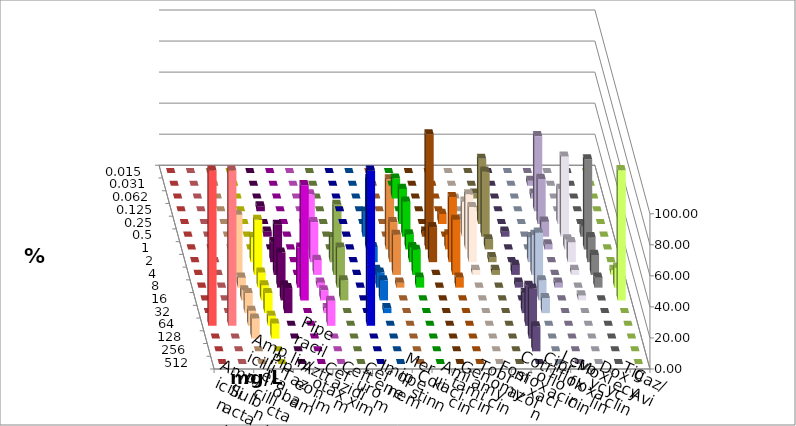
| Category | Ampicillin | Ampicillin/ Sulbactam | Piperacillin | Piperacillin/ Tazobactam | Aztreonam | Cefotaxim | Ceftazidim | Cefuroxim | Imipenem | Meropenem | Colistin | Amikacin | Gentamicin | Tobramycin | Fosfomycin | Cotrimoxazol | Ciprofloxacin | Levofloxacin | Moxifloxacin | Doxycyclin | Tigecyclin | Caz/Avi |
|---|---|---|---|---|---|---|---|---|---|---|---|---|---|---|---|---|---|---|---|---|---|---|
| 0.015 | 0 | 0 | 0 | 0 | 0 | 0 | 0 | 0 | 0 | 0 | 0 | 0 | 0 | 0 | 0 | 0 | 0 | 0 | 0 | 0 | 0 | 0 |
| 0.031 | 0 | 0 | 0 | 0 | 0 | 0 | 0 | 0 | 0 | 0 | 0 | 0 | 0 | 0 | 0 | 0 | 3.226 | 0 | 0 | 0 | 0 | 0 |
| 0.062 | 0 | 0 | 0 | 0 | 0 | 0 | 0 | 0 | 0 | 12.903 | 0 | 0 | 0 | 3.226 | 0 | 0 | 3.226 | 0 | 0 | 0 | 0 | 0 |
| 0.125 | 0 | 0 | 0 | 0 | 3.226 | 0 | 0 | 0 | 0 | 0 | 0 | 0 | 0 | 0 | 0 | 0 | 48.387 | 0 | 0 | 0 | 0 | 0 |
| 0.25 | 0 | 0 | 0 | 0 | 0 | 0 | 0 | 0 | 0 | 22.581 | 0 | 6.452 | 3.226 | 41.935 | 0 | 0 | 29.032 | 22.581 | 0 | 0 | 0 | 0 |
| 0.5 | 0 | 0 | 0 | 0 | 3.226 | 0 | 0 | 0 | 16.129 | 22.581 | 3.226 | 0 | 22.581 | 41.935 | 3.226 | 0 | 9.677 | 51.613 | 6.452 | 0 | 0 | 0 |
| 1.0 | 0 | 0 | 0 | 0 | 0 | 0 | 35.484 | 0 | 45.161 | 9.677 | 74.194 | 9.677 | 35.484 | 6.452 | 0 | 0 | 3.226 | 6.452 | 58.065 | 0 | 0 | 45.161 |
| 2.0 | 0 | 0 | 12.903 | 16.129 | 12.903 | 0 | 25.806 | 0 | 9.677 | 9.677 | 22.581 | 41.935 | 35.484 | 3.226 | 0 | 16.129 | 0 | 12.903 | 16.129 | 0 | 16.129 | 25.806 |
| 4.0 | 0 | 0 | 38.71 | 35.484 | 32.258 | 0 | 9.677 | 0 | 3.226 | 16.129 | 0 | 35.484 | 3.226 | 3.226 | 6.452 | 25.806 | 0 | 3.226 | 12.903 | 3.226 | 45.161 | 25.806 |
| 8.0 | 0 | 0 | 6.452 | 9.677 | 22.581 | 25.806 | 3.226 | 0 | 9.677 | 6.452 | 0 | 6.452 | 0 | 0 | 3.226 | 35.484 | 3.226 | 0 | 6.452 | 12.903 | 25.806 | 3.226 |
| 16.0 | 0 | 0 | 6.452 | 9.677 | 9.677 | 74.194 | 6.452 | 0 | 12.903 | 0 | 0 | 0 | 0 | 0 | 0 | 12.903 | 0 | 3.226 | 0 | 83.871 | 12.903 | 0 |
| 32.0 | 0 | 0 | 12.903 | 12.903 | 16.129 | 0 | 3.226 | 0 | 3.226 | 0 | 0 | 0 | 0 | 0 | 12.903 | 9.677 | 0 | 0 | 0 | 0 | 0 | 0 |
| 64.0 | 100 | 100 | 9.677 | 6.452 | 0 | 0 | 16.129 | 100 | 0 | 0 | 0 | 0 | 0 | 0 | 25.806 | 0 | 0 | 0 | 0 | 0 | 0 | 0 |
| 128.0 | 0 | 0 | 12.903 | 9.677 | 0 | 0 | 0 | 0 | 0 | 0 | 0 | 0 | 0 | 0 | 32.258 | 0 | 0 | 0 | 0 | 0 | 0 | 0 |
| 256.0 | 0 | 0 | 0 | 0 | 0 | 0 | 0 | 0 | 0 | 0 | 0 | 0 | 0 | 0 | 16.129 | 0 | 0 | 0 | 0 | 0 | 0 | 0 |
| 512.0 | 0 | 0 | 0 | 0 | 0 | 0 | 0 | 0 | 0 | 0 | 0 | 0 | 0 | 0 | 0 | 0 | 0 | 0 | 0 | 0 | 0 | 0 |